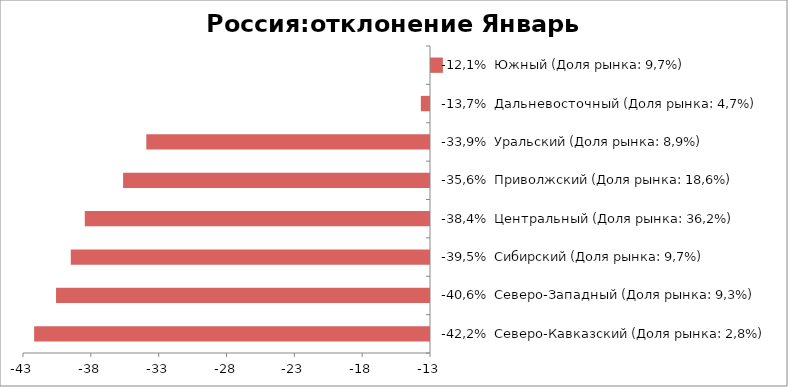
| Category | Россия:отклонение Январь 2016-2015 |
|---|---|
| -42,2%  Северо-Кавказский (Доля рынка: 2,8%) | -42.18 |
| -40,6%  Северо-Западный (Доля рынка: 9,3%) | -40.565 |
| -39,5%  Сибирский (Доля рынка: 9,7%) | -39.478 |
| -38,4%  Центральный (Доля рынка: 36,2%) | -38.446 |
| -35,6%  Приволжский (Доля рынка: 18,6%) | -35.622 |
| -33,9%  Уральский (Доля рынка: 8,9%) | -33.91 |
| -13,7%  Дальневосточный (Доля рынка: 4,7%) | -13.675 |
| -12,1%  Южный (Доля рынка: 9,7%) | -12.051 |